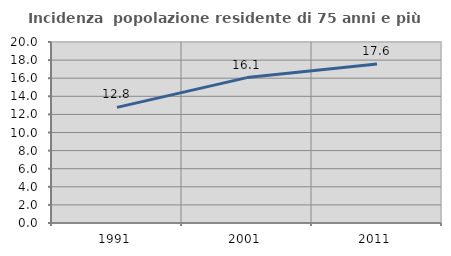
| Category | Incidenza  popolazione residente di 75 anni e più |
|---|---|
| 1991.0 | 12.778 |
| 2001.0 | 16.067 |
| 2011.0 | 17.581 |